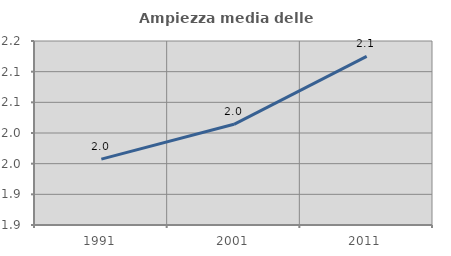
| Category | Ampiezza media delle famiglie |
|---|---|
| 1991.0 | 1.957 |
| 2001.0 | 2.014 |
| 2011.0 | 2.125 |